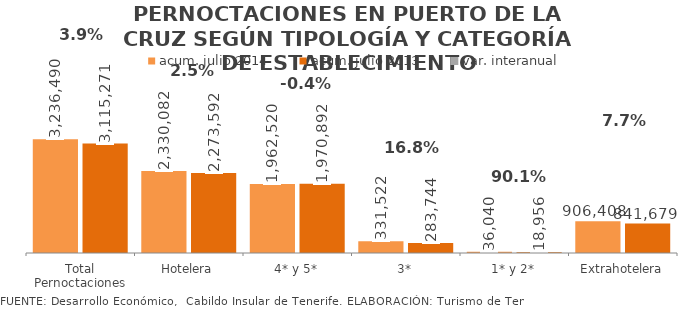
| Category | acum. julio 2014 | acum. julio 2013 |
|---|---|---|
| Total Pernoctaciones | 3236490 | 3115271 |
| Hotelera | 2330082 | 2273592 |
| 4* y 5* | 1962520 | 1970892 |
| 3* | 331522 | 283744 |
| 1* y 2* | 36040 | 18956 |
| Extrahotelera | 906408 | 841679 |